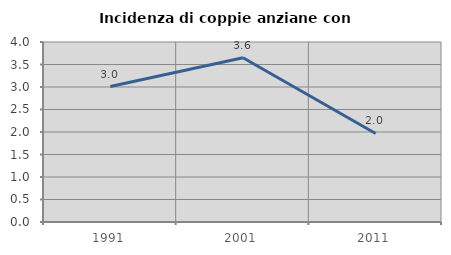
| Category | Incidenza di coppie anziane con figli |
|---|---|
| 1991.0 | 3.011 |
| 2001.0 | 3.648 |
| 2011.0 | 1.968 |